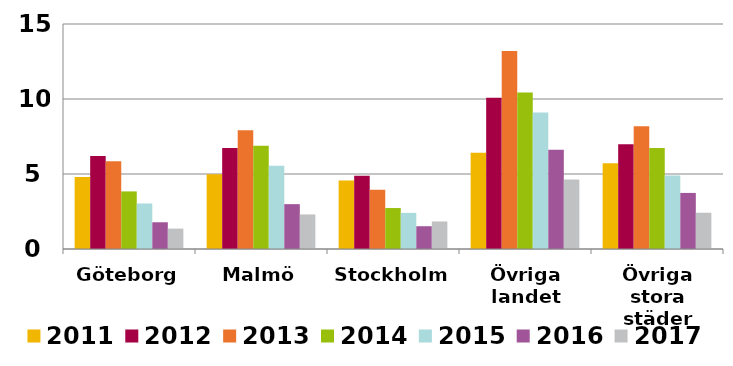
| Category | 2011 | 2012 | 2013 | 2014 | 2015 | 2016 | 2017 |
|---|---|---|---|---|---|---|---|
| Göteborg | 4.795 | 6.202 | 5.855 | 3.839 | 3.033 | 1.783 | 1.36 |
| Malmö | 4.98 | 6.729 | 7.914 | 6.89 | 5.546 | 2.99 | 2.305 |
| Stockholm | 4.572 | 4.88 | 3.957 | 2.731 | 2.408 | 1.519 | 1.835 |
| Övriga landet | 6.424 | 10.081 | 13.206 | 10.438 | 9.096 | 6.61 | 4.631 |
| Övriga stora städer | 5.717 | 6.982 | 8.183 | 6.725 | 4.893 | 3.738 | 2.416 |